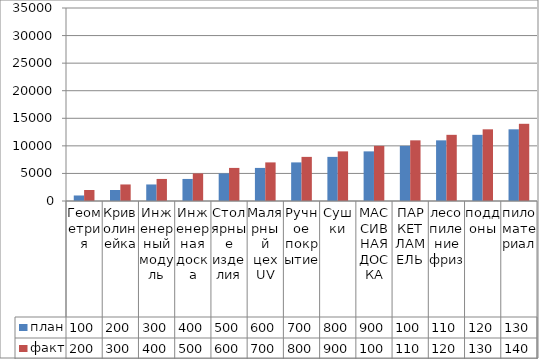
| Category | план | факт |
|---|---|---|
| Геометрия | 1000 | 2000 |
| Криволинейка | 2000 | 3000 |
| Инженерный модуль | 3000 | 4000 |
| Инженерная доска | 4000 | 5000 |
| Столярные изделия | 5000 | 6000 |
| Малярный цех UV | 6000 | 7000 |
| Ручное покрытие | 7000 | 8000 |
| Сушки | 8000 | 9000 |
| МАССИВНАЯ ДОСКА | 9000 | 10000 |
| ПАРКЕТ ЛАМЕЛЬ | 10000 | 11000 |
| лесопиление фриз | 11000 | 12000 |
| поддоны | 12000 | 13000 |
| пиломатериал | 13000 | 14000 |